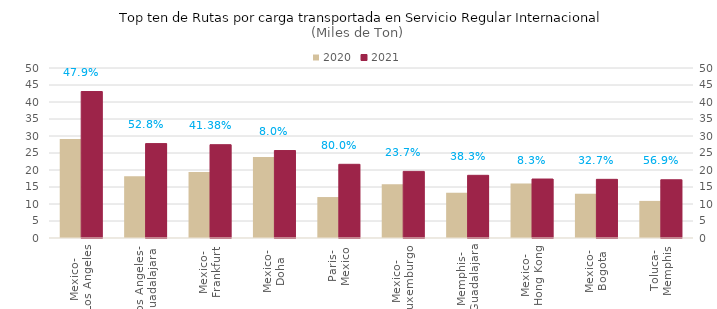
| Category | 2020 | 2021 |
|---|---|---|
| Mexico-
Los Angeles | 29121.255 | 43082.159 |
| Los Angeles-
Guadalajara | 18171.233 | 27764.453 |
| Mexico-
Frankfurt | 19410.828 | 27443.84 |
| Mexico-
Doha | 23819.155 | 25725.197 |
| Paris-
Mexico | 12042.487 | 21677.157 |
| Mexico-
Luxemburgo | 15831.884 | 19591.782 |
| Memphis-
Guadalajara | 13329.71 | 18434.82 |
| Mexico-
Hong Kong | 16015.225 | 17347.289 |
| Mexico-
Bogota | 13002.715 | 17255.253 |
| Toluca-
Memphis | 10915.186 | 17126.45 |